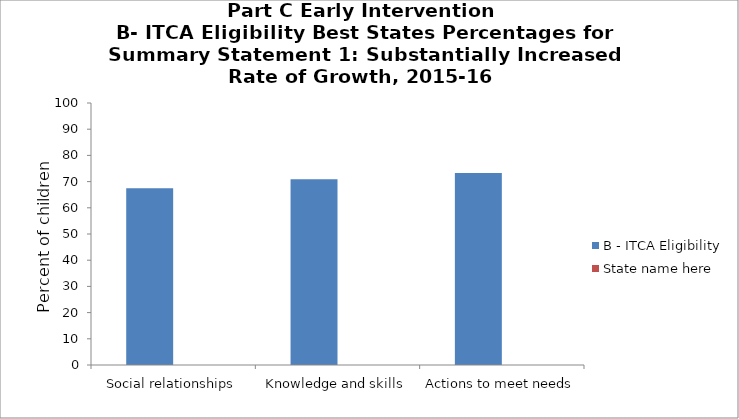
| Category | B - ITCA Eligibility | State name here |
|---|---|---|
| Social relationships | 67.5 |  |
| Knowledge and skills | 70.9 |  |
| Actions to meet needs | 73.3 |  |